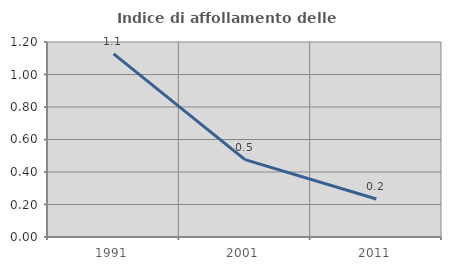
| Category | Indice di affollamento delle abitazioni  |
|---|---|
| 1991.0 | 1.127 |
| 2001.0 | 0.476 |
| 2011.0 | 0.234 |